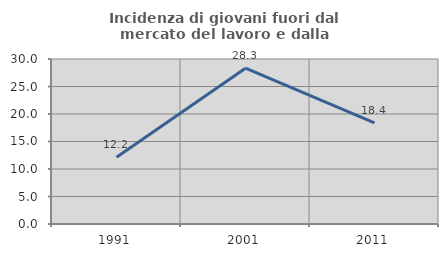
| Category | Incidenza di giovani fuori dal mercato del lavoro e dalla formazione  |
|---|---|
| 1991.0 | 12.151 |
| 2001.0 | 28.336 |
| 2011.0 | 18.398 |